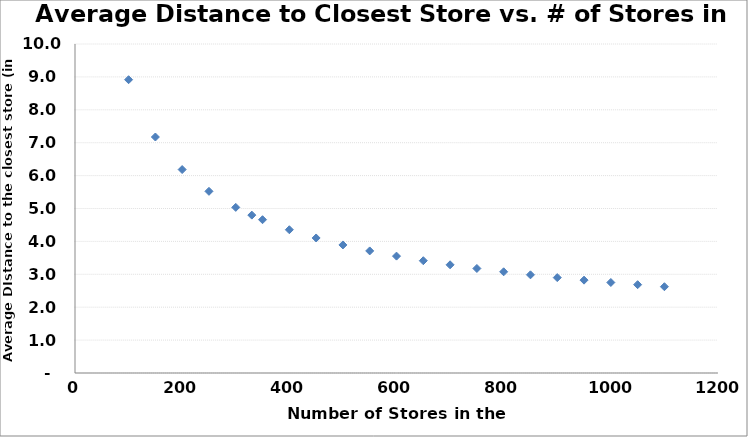
| Category | Series 0 |
|---|---|
| 100.0 | 8.915 |
| 150.0 | 7.173 |
| 200.0 | 6.184 |
| 250.0 | 5.522 |
| 300.0 | 5.034 |
| 330.0 | 4.799 |
| 350.0 | 4.659 |
| 400.0 | 4.354 |
| 450.0 | 4.104 |
| 500.0 | 3.892 |
| 550.0 | 3.71 |
| 600.0 | 3.552 |
| 650.0 | 3.413 |
| 700.0 | 3.288 |
| 750.0 | 3.177 |
| 800.0 | 3.076 |
| 850.0 | 2.984 |
| 900.0 | 2.9 |
| 950.0 | 2.822 |
| 1000.0 | 2.751 |
| 1050.0 | 2.685 |
| 1100.0 | 2.623 |